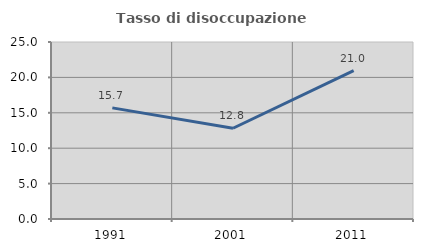
| Category | Tasso di disoccupazione giovanile  |
|---|---|
| 1991.0 | 15.698 |
| 2001.0 | 12.821 |
| 2011.0 | 20.968 |